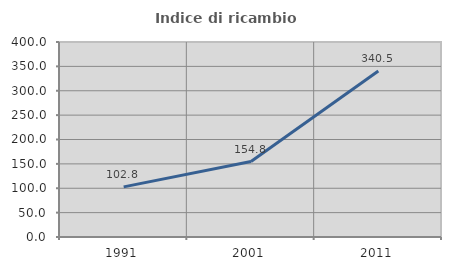
| Category | Indice di ricambio occupazionale  |
|---|---|
| 1991.0 | 102.829 |
| 2001.0 | 154.772 |
| 2011.0 | 340.467 |